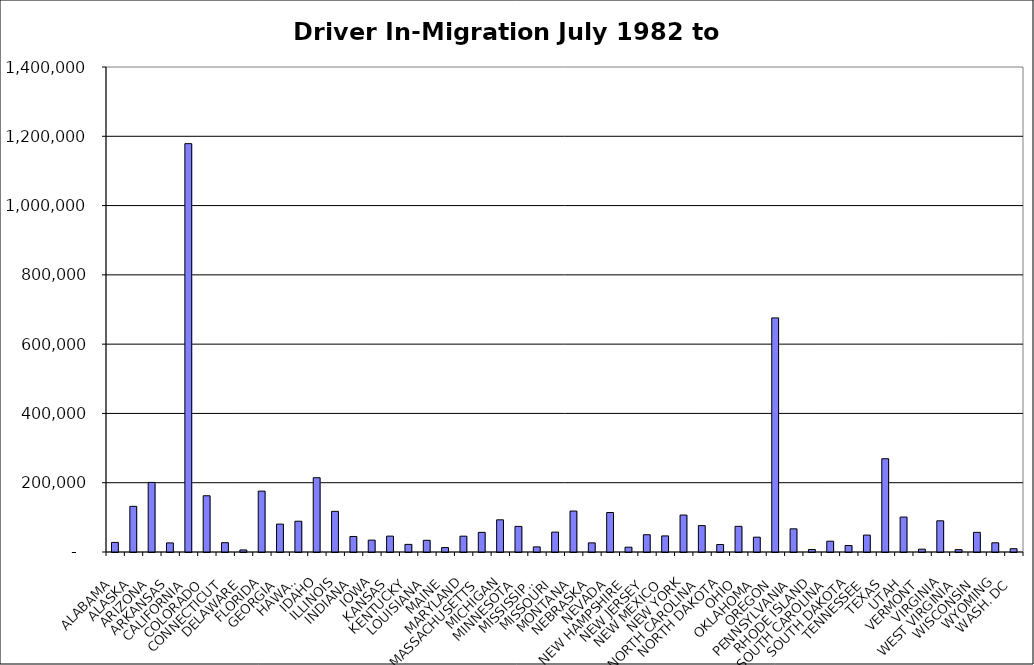
| Category | Series 0 |
|---|---|
| ALABAMA | 27723.5 |
| ALASKA | 131779.5 |
| ARIZONA | 200807 |
| ARKANSAS | 26294.5 |
| CALIFORNIA | 1178765.5 |
| COLORADO | 162357 |
| CONNECTICUT | 26917 |
| DELAWARE | 5929.5 |
| FLORIDA | 175754 |
| GEORGIA | 80519 |
| HAWAII | 88848.5 |
| IDAHO | 214375.5 |
| ILLINOIS | 117328.5 |
| INDIANA | 44796 |
| IOWA | 34319.5 |
| KANSAS | 45850.5 |
| KENTUCKY | 21971 |
| LOUISIANA | 33781.5 |
| MAINE | 12754.5 |
| MARYLAND | 45685 |
| MASSACHUSETTS | 56719 |
| MICHIGAN | 92885 |
| MINNESOTA | 73903.5 |
| MISSISSIPPI | 14727 |
| MISSOURI | 57381 |
| MONTANA | 118207 |
| NEBRASKA | 26349.5 |
| NEVADA | 113950 |
| NEW HAMPSHIRE | 13880.5 |
| NEW JERSEY | 49845 |
| NEW MEXICO | 46421 |
| NEW YORK | 106629 |
| NORTH CAROLINA | 76187.5 |
| NORTH DAKOTA | 21616.5 |
| OHIO | 74099.5 |
| OKLAHOMA | 42781 |
| OREGON | 675748 |
| PENNSYLVANIA | 66872.5 |
| RHODE ISLAND | 7293 |
| SOUTH CAROLINA | 31183.5 |
| SOUTH DAKOTA | 18671.5 |
| TENNESSEE | 48807.5 |
| TEXAS | 269252 |
| UTAH | 100843.5 |
| VERMONT | 8162 |
| VIRGINIA | 90063 |
| WEST VIRGINIA | 6890.5 |
| WISCONSIN | 56731.5 |
| WYOMING | 26582 |
| WASH. DC | 9485 |